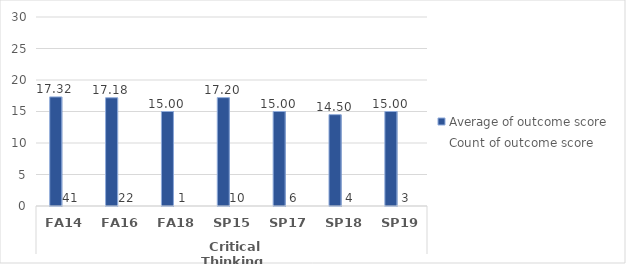
| Category | PTA.AAS - Average of outcome score | PTA.AAS - Count of outcome score |
|---|---|---|
| 0 | 17.317 | 41 |
| 1 | 17.182 | 22 |
| 2 | 15 | 1 |
| 3 | 17.2 | 10 |
| 4 | 15 | 6 |
| 5 | 14.5 | 4 |
| 6 | 15 | 3 |